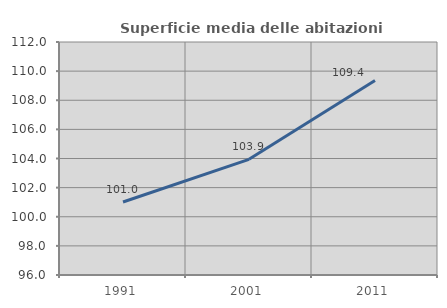
| Category | Superficie media delle abitazioni occupate |
|---|---|
| 1991.0 | 101.012 |
| 2001.0 | 103.943 |
| 2011.0 | 109.36 |